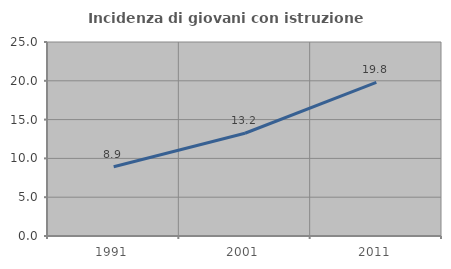
| Category | Incidenza di giovani con istruzione universitaria |
|---|---|
| 1991.0 | 8.929 |
| 2001.0 | 13.243 |
| 2011.0 | 19.807 |